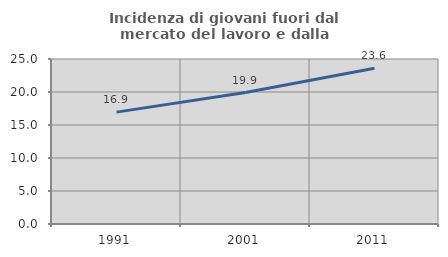
| Category | Incidenza di giovani fuori dal mercato del lavoro e dalla formazione  |
|---|---|
| 1991.0 | 16.949 |
| 2001.0 | 19.915 |
| 2011.0 | 23.596 |